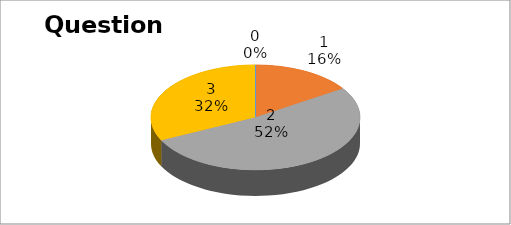
| Category | Series 0 |
|---|---|
| 0 | 0 |
| 1 | 19 |
| 2 | 63 |
| 3 | 39 |